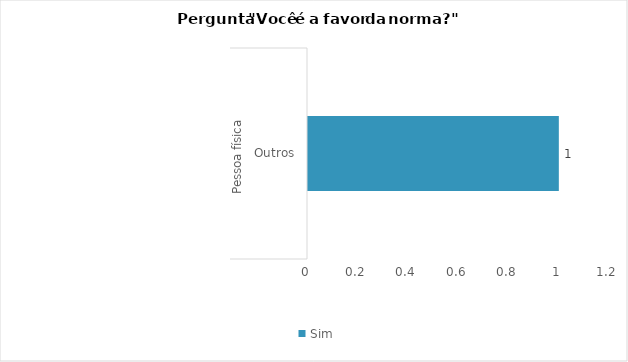
| Category | Sim |
|---|---|
| 0 | 1 |